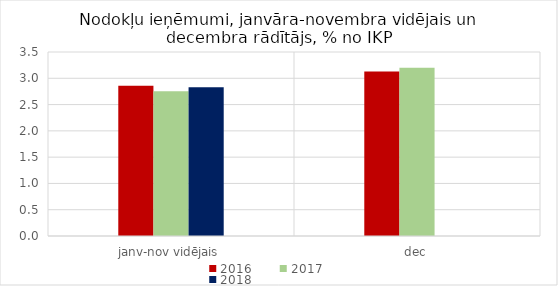
| Category | 2016 | 2017 | 2018 |
|---|---|---|---|
| janv-nov vidējais | 2.859 | 2.755 | 2.828 |
| dec | 3.13 | 3.203 | 0 |